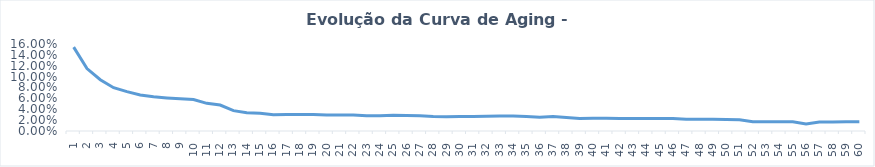
| Category | Particulares |
|---|---|
| 1 | 0.154 |
| 2 | 0.115 |
| 3 | 0.094 |
| 4 | 0.08 |
| 5 | 0.072 |
| 6 | 0.066 |
| 7 | 0.063 |
| 8 | 0.061 |
| 9 | 0.059 |
| 10 | 0.058 |
| 11 | 0.051 |
| 12 | 0.048 |
| 13 | 0.037 |
| 14 | 0.034 |
| 15 | 0.033 |
| 16 | 0.03 |
| 17 | 0.03 |
| 18 | 0.03 |
| 19 | 0.03 |
| 20 | 0.029 |
| 21 | 0.029 |
| 22 | 0.03 |
| 23 | 0.028 |
| 24 | 0.028 |
| 25 | 0.029 |
| 26 | 0.029 |
| 27 | 0.028 |
| 28 | 0.027 |
| 29 | 0.026 |
| 30 | 0.026 |
| 31 | 0.027 |
| 32 | 0.027 |
| 33 | 0.027 |
| 34 | 0.028 |
| 35 | 0.027 |
| 36 | 0.026 |
| 37 | 0.026 |
| 38 | 0.025 |
| 39 | 0.023 |
| 40 | 0.023 |
| 41 | 0.023 |
| 42 | 0.023 |
| 43 | 0.023 |
| 44 | 0.023 |
| 45 | 0.023 |
| 46 | 0.023 |
| 47 | 0.022 |
| 48 | 0.021 |
| 49 | 0.022 |
| 50 | 0.021 |
| 51 | 0.021 |
| 52 | 0.017 |
| 53 | 0.017 |
| 54 | 0.017 |
| 55 | 0.017 |
| 56 | 0.013 |
| 57 | 0.017 |
| 58 | 0.016 |
| 59 | 0.017 |
| 60 | 0.017 |